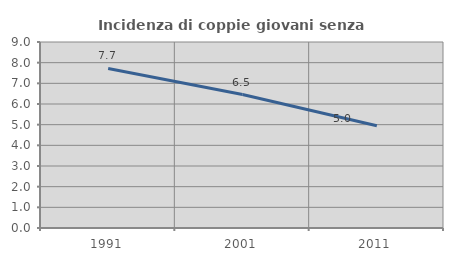
| Category | Incidenza di coppie giovani senza figli |
|---|---|
| 1991.0 | 7.72 |
| 2001.0 | 6.456 |
| 2011.0 | 4.952 |